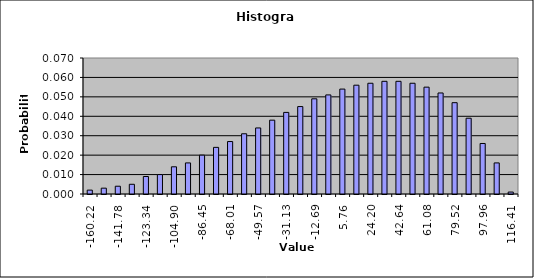
| Category | DISTRIBUTION SCHEDULE |
|---|---|
| -160.2223248591007 | 0.002 |
| -151.0013616483473 | 0.003 |
| -141.78039843759393 | 0.004 |
| -132.55943522684055 | 0.005 |
| -123.33847201608717 | 0.009 |
| -114.11750880533378 | 0.01 |
| -104.8965455945804 | 0.014 |
| -95.67558238382702 | 0.016 |
| -86.45461917307364 | 0.02 |
| -77.23365596232026 | 0.024 |
| -68.01269275156687 | 0.027 |
| -58.791729540813485 | 0.031 |
| -49.570766330060096 | 0.034 |
| -40.349803119306706 | 0.038 |
| -31.128839908553317 | 0.042 |
| -21.907876697799928 | 0.045 |
| -12.68691348704654 | 0.049 |
| -3.465950276293153 | 0.051 |
| 5.755012934460234 | 0.054 |
| 14.975976145213622 | 0.056 |
| 24.19693935596701 | 0.057 |
| 33.4179025667204 | 0.058 |
| 42.63886577747379 | 0.058 |
| 51.85982898822718 | 0.057 |
| 61.08079219898057 | 0.055 |
| 70.30175540973396 | 0.052 |
| 79.52271862048734 | 0.047 |
| 88.74368183124072 | 0.039 |
| 97.9646450419941 | 0.026 |
| 105.86832779406843 | 0.016 |
| 116.40657146350095 | 0.001 |